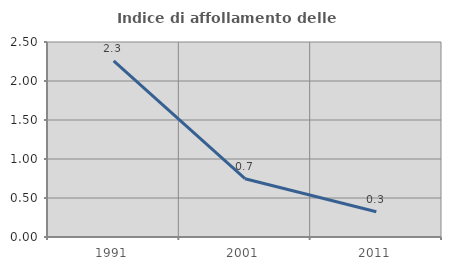
| Category | Indice di affollamento delle abitazioni  |
|---|---|
| 1991.0 | 2.259 |
| 2001.0 | 0.747 |
| 2011.0 | 0.324 |